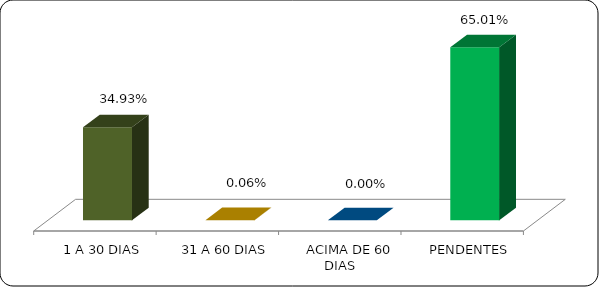
| Category | Series 0 |
|---|---|
|      1 A 30 DIAS | 0.349 |
|      31 A 60 DIAS | 0.001 |
|      ACIMA DE 60 DIAS | 0 |
|      PENDENTES | 0.65 |